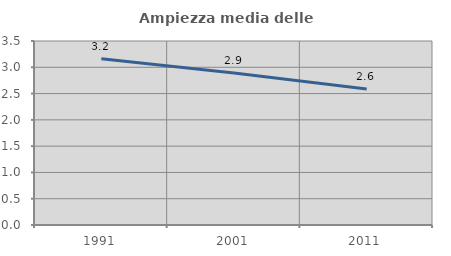
| Category | Ampiezza media delle famiglie |
|---|---|
| 1991.0 | 3.164 |
| 2001.0 | 2.891 |
| 2011.0 | 2.585 |